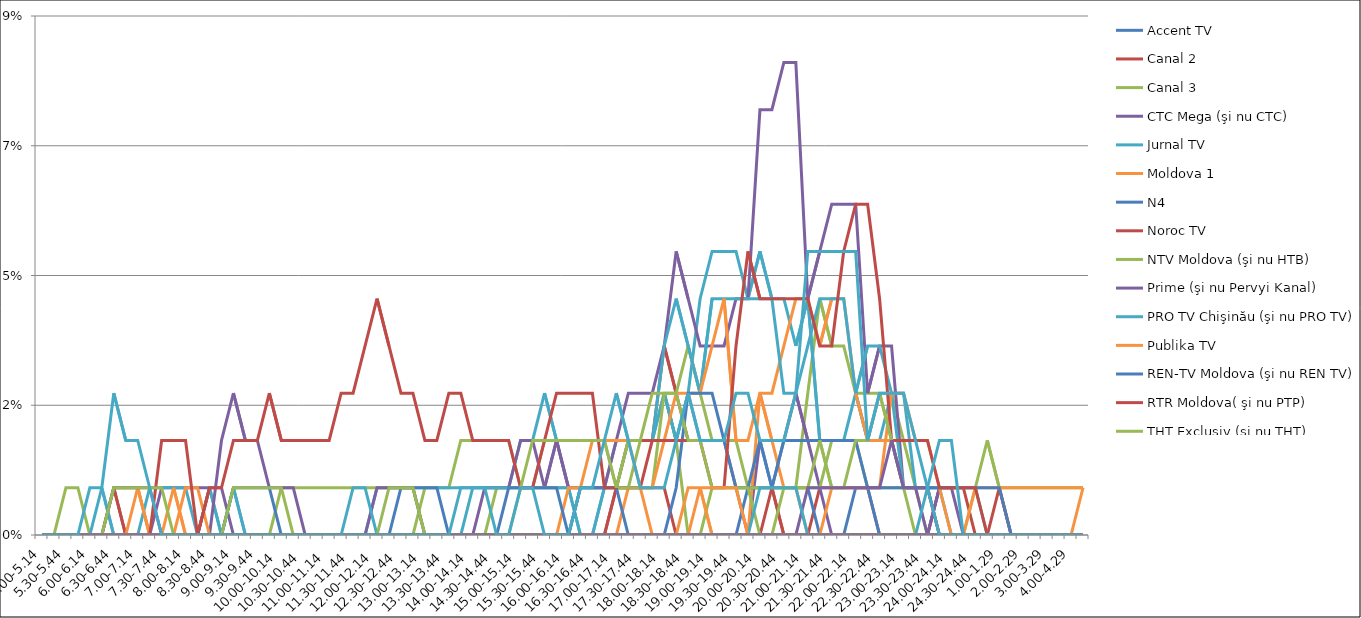
| Category | Accent TV | Canal 2 | Canal 3 | CTC Mega (şi nu CTC) | Jurnal TV | Moldova 1 | N4 | Noroc TV | NTV Moldova (şi nu HTB) | Prime (şi nu Pervyi Kanal) | PRO TV Chişinău (şi nu PRO TV) | Publika TV  | REN-TV Moldova (şi nu REN TV)  | RTR Moldova( şi nu PTP)  | THT Exclusiv (şi nu THT) | TV8 | TVC 21 | TVR MOLDOVA (şi nu TVR) | Canal Regional | Familia Domashniy | ITV | Moldova 2 | Alt canal |
|---|---|---|---|---|---|---|---|---|---|---|---|---|---|---|---|---|---|---|---|---|---|---|---|
| 5.00-5.14 | 0 | 0 | 0 | 0 | 0 | 0 | 0 | 0 | 0 | 0 | 0 | 0 | 0 | 0 | 0 | 0 | 0 | 0 | 0 | 0 | 0 | 0 | 0 |
| 5.15-5.29 | 0 | 0 | 0 | 0 | 0 | 0 | 0 | 0 | 0 | 0 | 0 | 0 | 0 | 0 | 0 | 0 | 0 | 0 | 0 | 0 | 0 | 0 | 0 |
| 5.30-5.44 | 0 | 0 | 0.008 | 0 | 0 | 0 | 0 | 0 | 0 | 0 | 0 | 0 | 0 | 0 | 0 | 0 | 0 | 0 | 0 | 0 | 0 | 0 | 0 |
| 5.45-5.59 | 0 | 0 | 0.008 | 0 | 0 | 0 | 0 | 0 | 0 | 0 | 0 | 0 | 0 | 0 | 0 | 0 | 0 | 0 | 0 | 0 | 0 | 0 | 0 |
| 6.00-6.14 | 0 | 0 | 0 | 0 | 0 | 0 | 0 | 0 | 0 | 0 | 0 | 0 | 0 | 0 | 0 | 0 | 0 | 0 | 0 | 0 | 0 | 0 | 0.008 |
| 6.15-6.29 | 0 | 0 | 0 | 0 | 0.008 | 0 | 0 | 0 | 0 | 0 | 0 | 0 | 0 | 0 | 0 | 0 | 0 | 0 | 0 | 0 | 0 | 0 | 0.008 |
| 6.30-6.44 | 0 | 0.008 | 0.008 | 0 | 0 | 0 | 0 | 0 | 0 | 0.008 | 0 | 0 | 0 | 0 | 0.008 | 0 | 0 | 0 | 0 | 0 | 0 | 0 | 0.025 |
| 6.45-6.59 | 0 | 0 | 0.008 | 0 | 0 | 0 | 0 | 0 | 0 | 0.008 | 0 | 0 | 0 | 0 | 0.008 | 0 | 0 | 0 | 0 | 0 | 0 | 0 | 0.016 |
| 7.00-7.14 | 0 | 0 | 0.008 | 0 | 0 | 0.008 | 0 | 0 | 0 | 0.008 | 0 | 0 | 0 | 0 | 0.008 | 0 | 0 | 0 | 0 | 0 | 0 | 0 | 0.016 |
| 7.15-7.29 | 0 | 0 | 0 | 0 | 0.008 | 0 | 0 | 0 | 0 | 0.008 | 0 | 0 | 0 | 0 | 0.008 | 0 | 0 | 0 | 0 | 0 | 0 | 0 | 0.008 |
| 7.30-7.44 | 0 | 0 | 0 | 0.008 | 0.008 | 0 | 0 | 0 | 0 | 0 | 0 | 0 | 0 | 0.016 | 0.008 | 0 | 0 | 0 | 0 | 0 | 0 | 0 | 0 |
| 7.45-7.59 | 0 | 0 | 0 | 0.008 | 0.008 | 0.008 | 0 | 0 | 0 | 0 | 0 | 0 | 0 | 0.016 | 0 | 0 | 0 | 0 | 0 | 0 | 0 | 0 | 0 |
| 8.00-8.14 | 0 | 0 | 0 | 0.008 | 0.008 | 0 | 0 | 0 | 0 | 0 | 0 | 0.008 | 0 | 0.016 | 0 | 0 | 0 | 0 | 0 | 0 | 0 | 0 | 0 |
| 8.15-8.29 | 0 | 0 | 0 | 0.008 | 0 | 0 | 0 | 0 | 0 | 0 | 0 | 0.008 | 0 | 0 | 0 | 0 | 0 | 0 | 0 | 0 | 0 | 0 | 0 |
| 8.30-8.44 | 0 | 0 | 0 | 0.008 | 0.008 | 0 | 0 | 0 | 0 | 0 | 0 | 0 | 0 | 0.008 | 0 | 0 | 0 | 0 | 0 | 0 | 0 | 0 | 0 |
| 8.45-8.59 | 0 | 0 | 0 | 0.008 | 0 | 0 | 0 | 0 | 0 | 0.016 | 0 | 0 | 0 | 0.008 | 0 | 0 | 0 | 0 | 0 | 0 | 0 | 0 | 0 |
| 9.00-9.14 | 0 | 0 | 0 | 0 | 0.008 | 0 | 0 | 0 | 0 | 0.025 | 0 | 0 | 0.008 | 0.016 | 0.008 | 0 | 0 | 0 | 0 | 0 | 0 | 0 | 0 |
| 9.15-9.29 | 0 | 0 | 0 | 0 | 0 | 0 | 0 | 0 | 0 | 0.016 | 0 | 0 | 0.008 | 0.016 | 0.008 | 0 | 0 | 0 | 0 | 0 | 0 | 0 | 0 |
| 9.30-9.44 | 0 | 0 | 0 | 0 | 0 | 0 | 0 | 0 | 0 | 0.016 | 0 | 0 | 0.008 | 0.016 | 0.008 | 0 | 0 | 0 | 0 | 0 | 0 | 0 | 0 |
| 9.45-9.59 | 0 | 0 | 0 | 0 | 0 | 0 | 0 | 0 | 0 | 0.008 | 0 | 0 | 0.008 | 0.025 | 0.008 | 0 | 0 | 0 | 0 | 0 | 0 | 0 | 0 |
| 10.00-10.14 | 0 | 0 | 0 | 0 | 0 | 0 | 0 | 0 | 0.008 | 0.008 | 0 | 0 | 0 | 0.016 | 0.008 | 0 | 0 | 0 | 0 | 0 | 0 | 0 | 0 |
| 10.15-10.29 | 0 | 0 | 0 | 0 | 0 | 0 | 0 | 0 | 0.008 | 0.008 | 0 | 0 | 0 | 0.016 | 0 | 0 | 0 | 0 | 0 | 0 | 0 | 0 | 0 |
| 10.30-10.44 | 0 | 0 | 0 | 0 | 0 | 0 | 0 | 0 | 0.008 | 0 | 0 | 0 | 0 | 0.016 | 0 | 0 | 0 | 0 | 0 | 0 | 0 | 0 | 0 |
| 10.45-10.59 | 0 | 0 | 0 | 0 | 0 | 0 | 0 | 0 | 0.008 | 0 | 0 | 0 | 0 | 0.016 | 0 | 0 | 0 | 0 | 0 | 0 | 0 | 0 | 0 |
| 11.00-11.14 | 0 | 0 | 0 | 0 | 0 | 0 | 0 | 0 | 0.008 | 0 | 0 | 0 | 0 | 0.016 | 0 | 0 | 0 | 0 | 0 | 0 | 0 | 0 | 0 |
| 11.15-11.29 | 0 | 0 | 0 | 0 | 0 | 0 | 0 | 0 | 0.008 | 0 | 0 | 0 | 0 | 0.025 | 0 | 0 | 0 | 0 | 0 | 0 | 0 | 0 | 0 |
| 11.30-11.44 | 0 | 0 | 0 | 0 | 0 | 0 | 0 | 0 | 0.008 | 0 | 0.008 | 0 | 0 | 0.025 | 0 | 0 | 0 | 0 | 0 | 0 | 0 | 0 | 0 |
| 11.45-11.59 | 0 | 0 | 0 | 0 | 0 | 0 | 0 | 0 | 0.008 | 0 | 0.008 | 0 | 0 | 0.033 | 0 | 0 | 0 | 0 | 0 | 0 | 0 | 0 | 0 |
| 12.00-12.14 | 0 | 0 | 0 | 0 | 0.008 | 0 | 0 | 0 | 0.008 | 0.008 | 0 | 0 | 0 | 0.041 | 0 | 0 | 0 | 0 | 0 | 0 | 0 | 0 | 0 |
| 12.15-12.29 | 0 | 0 | 0 | 0 | 0.008 | 0 | 0 | 0 | 0.008 | 0.008 | 0 | 0 | 0 | 0.033 | 0.008 | 0 | 0 | 0 | 0 | 0 | 0 | 0 | 0 |
| 12.30-12.44 | 0 | 0 | 0 | 0 | 0.008 | 0 | 0.008 | 0 | 0.008 | 0.008 | 0 | 0 | 0 | 0.025 | 0.008 | 0 | 0 | 0 | 0 | 0 | 0 | 0 | 0 |
| 12.45-12.59 | 0 | 0 | 0 | 0 | 0.008 | 0 | 0.008 | 0 | 0.008 | 0.008 | 0 | 0 | 0 | 0.025 | 0.008 | 0 | 0 | 0 | 0 | 0 | 0 | 0 | 0 |
| 13.00-13.14 | 0 | 0 | 0.008 | 0 | 0.008 | 0 | 0.008 | 0 | 0 | 0 | 0 | 0 | 0 | 0.016 | 0 | 0 | 0 | 0 | 0 | 0 | 0 | 0 | 0 |
| 13.15-13.29 | 0 | 0 | 0.008 | 0 | 0.008 | 0 | 0.008 | 0 | 0 | 0 | 0 | 0 | 0 | 0.016 | 0 | 0 | 0 | 0 | 0 | 0 | 0 | 0 | 0 |
| 13.30-13.44 | 0 | 0 | 0.008 | 0 | 0.008 | 0 | 0 | 0 | 0 | 0 | 0 | 0 | 0 | 0.025 | 0 | 0 | 0 | 0 | 0 | 0 | 0 | 0 | 0 |
| 13.45-13.59 | 0 | 0 | 0.016 | 0 | 0.008 | 0 | 0 | 0 | 0 | 0 | 0 | 0 | 0 | 0.025 | 0 | 0 | 0 | 0 | 0 | 0 | 0 | 0 | 0.008 |
| 14.00-14.14 | 0 | 0 | 0.016 | 0 | 0.008 | 0 | 0 | 0 | 0 | 0 | 0.008 | 0 | 0 | 0.016 | 0 | 0 | 0 | 0 | 0 | 0 | 0 | 0 | 0.008 |
| 14.15-14.29 | 0 | 0 | 0.016 | 0 | 0.008 | 0 | 0 | 0 | 0 | 0.008 | 0.008 | 0 | 0 | 0.016 | 0 | 0 | 0 | 0 | 0 | 0 | 0 | 0 | 0.008 |
| 14.30-14.44 | 0 | 0 | 0.016 | 0 | 0.008 | 0 | 0 | 0 | 0.008 | 0.008 | 0.008 | 0 | 0 | 0.016 | 0 | 0 | 0 | 0 | 0 | 0 | 0 | 0 | 0 |
| 14.45-14.59 | 0 | 0 | 0.016 | 0 | 0.008 | 0 | 0 | 0 | 0.008 | 0.008 | 0.008 | 0 | 0.008 | 0.016 | 0 | 0 | 0 | 0 | 0 | 0 | 0 | 0 | 0 |
| 15.00-15.14 | 0 | 0 | 0.008 | 0 | 0.016 | 0 | 0 | 0 | 0.008 | 0.016 | 0.008 | 0 | 0.008 | 0.008 | 0.008 | 0 | 0 | 0 | 0 | 0 | 0 | 0 | 0.008 |
| 15.15-15.29 | 0 | 0 | 0.008 | 0 | 0.016 | 0 | 0 | 0 | 0.008 | 0.016 | 0.008 | 0 | 0.008 | 0.008 | 0.016 | 0 | 0 | 0 | 0 | 0 | 0 | 0 | 0.008 |
| 15.30-15.44 | 0 | 0 | 0.016 | 0 | 0.025 | 0 | 0 | 0 | 0.008 | 0.008 | 0.008 | 0 | 0.008 | 0.016 | 0.016 | 0 | 0 | 0 | 0 | 0 | 0 | 0 | 0 |
| 15.45-15.59 | 0 | 0 | 0.016 | 0 | 0.016 | 0 | 0 | 0 | 0.008 | 0.016 | 0.008 | 0 | 0.008 | 0.025 | 0.016 | 0 | 0 | 0 | 0 | 0 | 0 | 0 | 0 |
| 16.00-16.14 | 0 | 0 | 0.016 | 0 | 0.008 | 0 | 0 | 0 | 0.008 | 0.008 | 0.008 | 0.008 | 0 | 0.025 | 0.016 | 0 | 0 | 0 | 0 | 0 | 0 | 0 | 0 |
| 16.15-16.29 | 0 | 0 | 0.016 | 0 | 0 | 0 | 0 | 0 | 0.008 | 0.008 | 0 | 0.008 | 0.008 | 0.025 | 0.016 | 0 | 0 | 0 | 0 | 0 | 0 | 0 | 0.008 |
| 16.30-16.44 | 0 | 0 | 0.016 | 0 | 0 | 0 | 0 | 0 | 0.008 | 0.008 | 0 | 0.016 | 0.008 | 0.025 | 0.016 | 0 | 0 | 0 | 0 | 0 | 0 | 0 | 0.008 |
| 16.45-16.59 | 0 | 0 | 0.016 | 0 | 0.008 | 0 | 0 | 0 | 0.008 | 0.008 | 0.008 | 0.016 | 0.008 | 0.008 | 0.016 | 0 | 0 | 0 | 0 | 0 | 0 | 0 | 0.016 |
| 17.00-17.14 | 0 | 0.008 | 0.008 | 0 | 0.016 | 0 | 0 | 0.008 | 0.008 | 0.016 | 0.008 | 0.016 | 0.008 | 0.008 | 0.008 | 0 | 0 | 0 | 0 | 0 | 0 | 0 | 0.025 |
| 17.15-17.29 | 0 | 0.008 | 0.008 | 0 | 0.016 | 0.008 | 0 | 0.008 | 0.008 | 0.025 | 0.016 | 0.016 | 0 | 0.016 | 0.016 | 0 | 0 | 0 | 0 | 0 | 0 | 0 | 0.016 |
| 17.30-17.44 | 0 | 0.008 | 0.016 | 0 | 0.016 | 0.008 | 0 | 0.008 | 0.008 | 0.025 | 0.016 | 0.008 | 0 | 0.016 | 0.016 | 0 | 0 | 0 | 0 | 0 | 0 | 0 | 0.008 |
| 17.45-17.59 | 0 | 0.016 | 0.016 | 0 | 0.016 | 0 | 0 | 0.008 | 0.008 | 0.025 | 0.016 | 0.008 | 0 | 0.016 | 0.025 | 0 | 0 | 0 | 0 | 0 | 0 | 0 | 0.008 |
| 18.00-18.14 | 0 | 0.033 | 0.025 | 0 | 0.025 | 0 | 0 | 0.008 | 0.025 | 0.033 | 0.033 | 0.016 | 0 | 0.016 | 0.025 | 0 | 0 | 0 | 0 | 0 | 0 | 0 | 0.008 |
| 18.15-18.29 | 0 | 0.025 | 0.016 | 0 | 0.016 | 0 | 0 | 0 | 0.025 | 0.049 | 0.041 | 0.025 | 0.008 | 0.016 | 0.025 | 0 | 0 | 0 | 0 | 0 | 0 | 0 | 0.016 |
| 18.30-18.44 | 0 | 0.016 | 0 | 0 | 0.025 | 0 | 0 | 0 | 0.033 | 0.041 | 0.033 | 0.025 | 0.025 | 0.016 | 0.016 | 0 | 0 | 0.008 | 0 | 0 | 0 | 0 | 0.025 |
| 18.45-18.59 | 0 | 0.016 | 0 | 0 | 0.041 | 0.008 | 0 | 0 | 0.025 | 0.033 | 0.025 | 0.025 | 0.025 | 0.016 | 0.016 | 0 | 0 | 0.008 | 0 | 0 | 0 | 0 | 0.016 |
| 19.00-19.14 | 0 | 0.016 | 0.008 | 0 | 0.049 | 0 | 0 | 0 | 0.016 | 0.033 | 0.041 | 0.033 | 0.025 | 0.008 | 0.008 | 0 | 0 | 0.008 | 0 | 0 | 0 | 0 | 0.016 |
| 19.15-19.29 | 0 | 0.016 | 0.008 | 0 | 0.049 | 0 | 0 | 0 | 0.016 | 0.033 | 0.041 | 0.041 | 0.016 | 0.008 | 0.008 | 0 | 0 | 0.008 | 0 | 0 | 0 | 0 | 0.016 |
| 19.30-19.44 | 0 | 0.008 | 0.008 | 0 | 0.049 | 0 | 0 | 0 | 0.016 | 0.041 | 0.041 | 0.016 | 0.008 | 0.033 | 0.008 | 0 | 0 | 0.008 | 0 | 0 | 0 | 0 | 0.025 |
| 19.45-19.59 | 0 | 0 | 0.008 | 0 | 0.041 | 0 | 0.008 | 0 | 0.008 | 0.041 | 0.041 | 0.016 | 0.008 | 0.049 | 0.008 | 0 | 0 | 0 | 0 | 0 | 0 | 0 | 0.025 |
| 20.00-20.14 | 0 | 0 | 0.008 | 0.016 | 0.049 | 0.025 | 0.008 | 0 | 0.008 | 0.074 | 0.041 | 0.025 | 0.016 | 0.041 | 0 | 0 | 0.008 | 0 | 0 | 0 | 0 | 0 | 0.016 |
| 20.15-20.29 | 0 | 0 | 0.008 | 0.016 | 0.041 | 0.025 | 0.008 | 0.008 | 0.008 | 0.074 | 0.041 | 0.016 | 0.008 | 0.041 | 0 | 0 | 0.008 | 0 | 0 | 0 | 0 | 0 | 0.016 |
| 20.30-20.44 | 0 | 0 | 0.008 | 0.016 | 0.041 | 0.033 | 0.008 | 0 | 0.008 | 0.082 | 0.025 | 0.008 | 0.016 | 0.041 | 0.008 | 0 | 0.008 | 0 | 0 | 0 | 0 | 0 | 0.016 |
| 20.45-20.59 | 0 | 0 | 0.008 | 0.025 | 0.033 | 0.041 | 0.008 | 0 | 0.008 | 0.082 | 0.025 | 0.008 | 0.016 | 0.041 | 0.008 | 0 | 0.008 | 0 | 0 | 0 | 0 | 0 | 0.025 |
| 21.00-21.14 | 0 | 0 | 0.025 | 0.016 | 0.041 | 0.041 | 0.008 | 0 | 0.008 | 0.041 | 0.033 | 0 | 0.016 | 0.041 | 0.008 | 0.008 | 0 | 0 | 0 | 0 | 0 | 0 | 0.049 |
| 21.15-21.29 | 0 | 0.008 | 0.041 | 0.008 | 0.016 | 0.033 | 0 | 0 | 0.008 | 0.049 | 0.041 | 0 | 0.016 | 0.033 | 0.016 | 0.008 | 0 | 0 | 0 | 0 | 0 | 0 | 0.049 |
| 21.30-21.44 | 0 | 0.008 | 0.033 | 0 | 0.016 | 0.041 | 0 | 0 | 0.016 | 0.057 | 0.041 | 0.008 | 0.016 | 0.033 | 0.008 | 0.008 | 0 | 0 | 0 | 0 | 0 | 0 | 0.049 |
| 21.45-21.59 | 0 | 0.008 | 0.033 | 0 | 0.016 | 0.041 | 0 | 0 | 0.016 | 0.057 | 0.041 | 0.008 | 0.016 | 0.049 | 0.008 | 0.008 | 0 | 0 | 0 | 0 | 0 | 0 | 0.049 |
| 22.00-22.14 | 0 | 0.008 | 0.025 | 0 | 0.025 | 0.025 | 0.008 | 0 | 0.016 | 0.057 | 0.025 | 0.008 | 0.016 | 0.057 | 0.016 | 0.008 | 0 | 0 | 0 | 0 | 0 | 0 | 0.049 |
| 22.15-22.29 | 0 | 0.008 | 0.025 | 0 | 0.016 | 0.016 | 0.008 | 0 | 0.008 | 0.025 | 0.033 | 0.008 | 0.008 | 0.057 | 0.016 | 0.008 | 0 | 0 | 0 | 0 | 0 | 0 | 0.016 |
| 22.30-22.44 | 0 | 0 | 0.025 | 0 | 0.016 | 0.016 | 0 | 0 | 0.008 | 0.033 | 0.033 | 0.008 | 0.008 | 0.041 | 0.025 | 0.008 | 0 | 0 | 0 | 0 | 0 | 0 | 0.025 |
| 22.45-22.59 | 0 | 0 | 0.025 | 0 | 0.025 | 0.016 | 0 | 0 | 0.008 | 0.033 | 0.025 | 0.025 | 0.008 | 0.016 | 0.016 | 0.016 | 0 | 0 | 0 | 0 | 0 | 0 | 0.025 |
| 23.00-23.14 | 0 | 0 | 0.016 | 0 | 0.025 | 0.008 | 0 | 0 | 0.008 | 0.008 | 0.008 | 0.025 | 0.008 | 0.016 | 0.008 | 0.008 | 0 | 0 | 0 | 0 | 0 | 0 | 0.025 |
| 23.15-23.29 | 0 | 0 | 0.008 | 0 | 0.008 | 0.008 | 0 | 0 | 0.008 | 0.008 | 0.008 | 0.016 | 0.008 | 0.016 | 0 | 0.008 | 0 | 0 | 0 | 0 | 0 | 0 | 0.016 |
| 23.30-23.44 | 0 | 0 | 0 | 0 | 0.008 | 0.008 | 0 | 0 | 0.008 | 0 | 0.008 | 0.016 | 0.008 | 0.016 | 0 | 0.008 | 0.008 | 0 | 0 | 0 | 0 | 0 | 0.008 |
| 23.45-23.59 | 0 | 0.008 | 0 | 0 | 0.008 | 0 | 0 | 0 | 0 | 0.008 | 0.008 | 0.008 | 0.008 | 0.008 | 0 | 0 | 0.016 | 0 | 0 | 0 | 0 | 0 | 0 |
| 24.00-24.14 | 0 | 0.008 | 0 | 0 | 0.008 | 0 | 0 | 0 | 0 | 0.008 | 0 | 0 | 0.008 | 0.008 | 0 | 0 | 0.016 | 0 | 0 | 0 | 0 | 0 | 0 |
| 24.15-24.29 | 0 | 0.008 | 0 | 0 | 0.008 | 0 | 0 | 0 | 0 | 0 | 0 | 0 | 0.008 | 0.008 | 0 | 0 | 0 | 0 | 0 | 0 | 0 | 0 | 0 |
| 24.30-24.44 | 0 | 0 | 0.008 | 0 | 0.008 | 0.008 | 0 | 0 | 0 | 0 | 0 | 0 | 0.008 | 0.008 | 0 | 0 | 0 | 0 | 0 | 0 | 0 | 0 | 0 |
| 24.45-24.59 | 0 | 0 | 0.016 | 0 | 0 | 0.008 | 0 | 0 | 0 | 0 | 0 | 0 | 0.008 | 0 | 0 | 0 | 0 | 0 | 0 | 0 | 0 | 0 | 0 |
| 1.00-1.29 | 0 | 0.008 | 0.008 | 0 | 0 | 0.008 | 0 | 0 | 0 | 0 | 0 | 0 | 0.008 | 0 | 0 | 0 | 0 | 0 | 0 | 0 | 0 | 0 | 0 |
| 1.30-1. 59 | 0 | 0 | 0.008 | 0 | 0 | 0.008 | 0 | 0 | 0 | 0 | 0 | 0 | 0 | 0 | 0 | 0 | 0 | 0 | 0 | 0 | 0 | 0 | 0 |
| 2.00-2.29 | 0 | 0 | 0.008 | 0 | 0 | 0.008 | 0 | 0 | 0 | 0 | 0 | 0 | 0 | 0 | 0 | 0 | 0 | 0 | 0 | 0 | 0 | 0 | 0 |
| 2.30-2.59 | 0 | 0 | 0.008 | 0 | 0 | 0.008 | 0 | 0 | 0 | 0 | 0 | 0 | 0 | 0 | 0 | 0 | 0 | 0 | 0 | 0 | 0 | 0 | 0 |
| 3.00-3.29 | 0 | 0 | 0.008 | 0 | 0 | 0.008 | 0 | 0 | 0 | 0 | 0 | 0 | 0 | 0 | 0 | 0 | 0 | 0 | 0 | 0 | 0 | 0 | 0 |
| 3.30-3.59 | 0 | 0 | 0.008 | 0 | 0 | 0.008 | 0 | 0 | 0 | 0 | 0 | 0 | 0 | 0 | 0 | 0 | 0 | 0 | 0 | 0 | 0 | 0 | 0 |
| 4.00-4.29 | 0 | 0 | 0.008 | 0 | 0 | 0.008 | 0 | 0 | 0 | 0 | 0 | 0 | 0 | 0 | 0 | 0 | 0 | 0 | 0 | 0 | 0 | 0 | 0 |
| 4.30-4.59 | 0 | 0 | 0.008 | 0 | 0 | 0.008 | 0 | 0 | 0 | 0 | 0 | 0.008 | 0 | 0 | 0 | 0 | 0 | 0 | 0 | 0 | 0 | 0 | 0 |